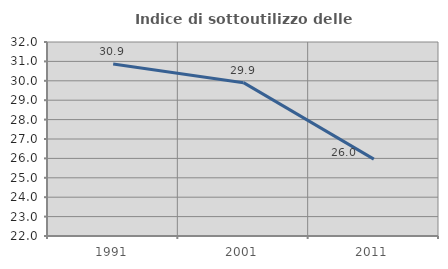
| Category | Indice di sottoutilizzo delle abitazioni  |
|---|---|
| 1991.0 | 30.871 |
| 2001.0 | 29.905 |
| 2011.0 | 25.962 |